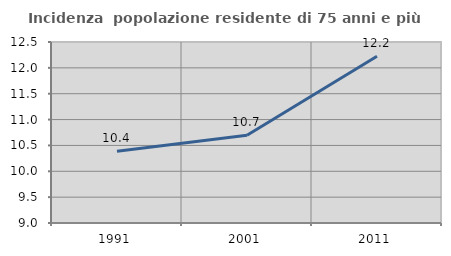
| Category | Incidenza  popolazione residente di 75 anni e più |
|---|---|
| 1991.0 | 10.39 |
| 2001.0 | 10.695 |
| 2011.0 | 12.223 |